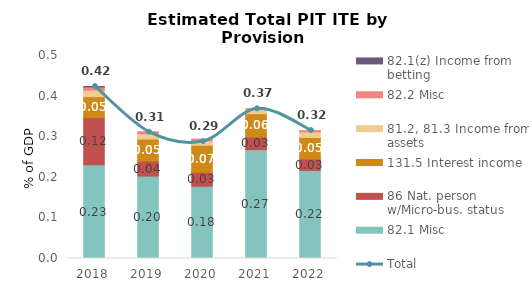
| Category | 82.1 Misc | 86 Nat. person w/Micro-bus. status | 131.5 Interest income  | 81.2, 81.3 Income from assets | 82.2 Misc | 82.1(z) Income from betting |
|---|---|---|---|---|---|---|
| 2018.0 | 0.231 | 0.116 | 0.052 | 0.016 | 0.008 | 0.001 |
| 2019.0 | 0.203 | 0.037 | 0.054 | 0.013 | 0.005 | 0 |
| 2020.0 | 0.178 | 0.034 | 0.067 | 0.011 | 0.004 | 0 |
| 2021.0 | 0.268 | 0.031 | 0.058 | 0.01 | 0.002 | 0 |
| 2022.0 | 0.217 | 0.028 | 0.053 | 0.014 | 0.003 | 0 |